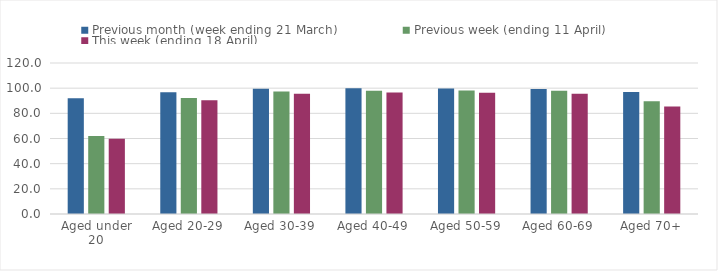
| Category | Previous month (week ending 21 March) | Previous week (ending 11 April) | This week (ending 18 April) |
|---|---|---|---|
| Aged under 20 | 91.94 | 62.067 | 59.708 |
| Aged 20-29 | 96.821 | 92.282 | 90.371 |
| Aged 30-39 | 99.473 | 97.272 | 95.507 |
| Aged 40-49 | 99.945 | 97.989 | 96.542 |
| Aged 50-59 | 99.804 | 98.129 | 96.456 |
| Aged 60-69 | 99.423 | 97.864 | 95.482 |
| Aged 70+ | 97.022 | 89.63 | 85.355 |